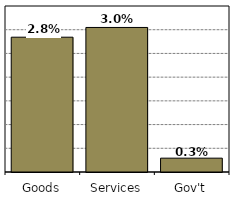
| Category | Series 0 |
|---|---|
| Goods | 0.028 |
| Services | 0.03 |
| Gov't | 0.003 |